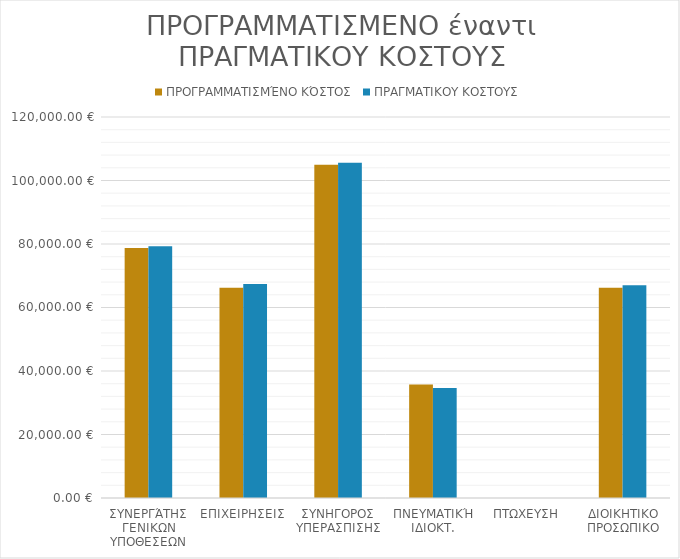
| Category | ΠΡΟΓΡΑΜΜΑΤΙΣΜΈΝΟ ΚΌΣΤΟΣ | ΠΡΑΓΜΑΤΙΚΟΥ ΚΟΣΤΟΥΣ |
|---|---|---|
| ΣΥΝΕΡΓΆΤΗΣ ΓΕΝΙΚΩΝ ΥΠΟΘΕΣΕΩΝ | 78750 | 79275 |
| ΕΠΙΧΕΙΡΗΣΕΙΣ | 66250 | 67375 |
| ΣΥΝΗΓΟΡΟΣ ΥΠΕΡΑΣΠΙΣΗΣ | 105000 | 105600 |
| ΠΝΕΥΜΑΤΙΚΉ ΙΔΙΟΚΤ. | 35750 | 34650 |
| ΠΤΩΧΕΥΣΗ | 0 | 0 |
| ΔΙΟΙΚΗΤΙΚΟ ΠΡΟΣΩΠΙΚΟ | 66250 | 67000 |